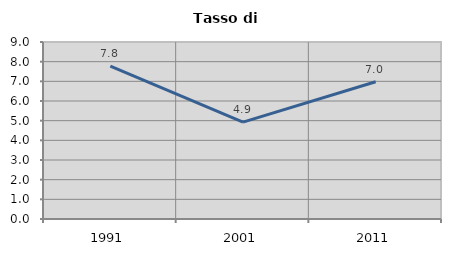
| Category | Tasso di disoccupazione   |
|---|---|
| 1991.0 | 7.773 |
| 2001.0 | 4.929 |
| 2011.0 | 6.978 |